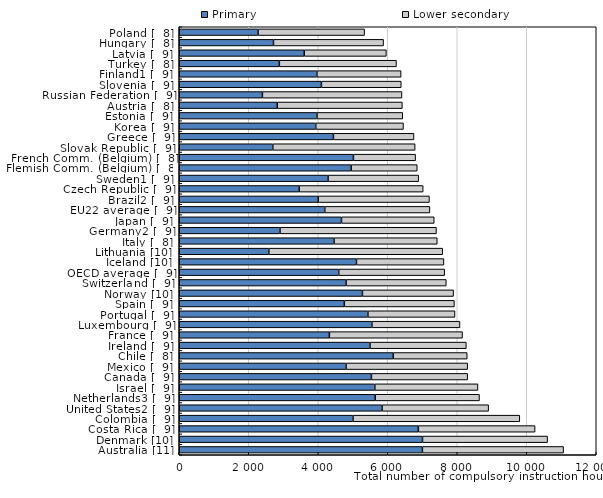
| Category | Primary | Lower secondary |
|---|---|---|
| Poland [  8] | 2268 | 3066 |
| Hungary [  8] | 2711.85 | 3168.3 |
| Latvia [  9] | 3595.68 | 2365.013 |
| Turkey [  8] | 2880 | 3371.04 |
| Finland1 [  9] | 3961.5 | 2422.5 |
| Slovenia [  9] | 4091.25 | 2297.645 |
| Russian Federation [  9] | 2393.25 | 4016.25 |
| Austria [  8] | 2820 | 3600 |
| Estonia [  9] | 3963.75 | 2467.5 |
| Korea [  9] | 3928 | 2524.5 |
| Greece [  9] | 4437 | 2317.248 |
| Slovak Republic [  9] | 2692.8 | 4095.3 |
| French Comm. (Belgium) [  8] | 5012 | 1790 |
| Flemish Comm. (Belgium) [  8] | 4946.667 | 1902.222 |
| Sweden1 [  9] | 4283 | 2607 |
| Czech Republic [  9] | 3451.5 | 3568.5 |
| Brazil2 [  9] | 4000 | 3200 |
| EU22 average [  9] | 4188.774 | 3024.058 |
| Japan [  9] | 4669.05 | 2668.75 |
| Germany2 [  9] | 2899.76 | 4502.115 |
| Italy [  8] | 4455 | 2970 |
| Lithuania [10] | 2578.176 | 5002.571 |
| Iceland [10] | 5100 | 2516 |
| OECD average [  9] | 4589.749 | 3048.577 |
| Switzerland [  9] | 4801 | 2884 |
| Norway [10] | 5272 | 2622 |
| Spain [  9] | 4750.431 | 3167.4 |
| Portugal [  9] | 5429.428 | 2505 |
| Luxembourg [  9] | 5544 | 2535 |
| France [  9] | 4320 | 3832 |
| Ireland [  9] | 5490 | 2772.023 |
| Chile [  8] | 6156.058 | 2130.866 |
| Mexico [  9] | 4800 | 3500 |
| Canada [  9] | 5529.884 | 2770.482 |
| Israel [  9] | 5628.516 | 2967.584 |
| Netherlands3 [  9] | 5640 | 3000 |
| United States2 [  9] | 5836.854 | 3066.371 |
| Colombia [  9] | 5000 | 4800 |
| Costa Rica [  9] | 6880 | 3360 |
| Denmark [10] | 7000 | 3600 |
| Australia [11] | 6997.565 | 4062.413 |